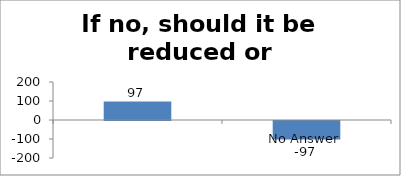
| Category | If no, should it be reduced or increased |
|---|---|
|  | 97 |
| No Answer | -97 |